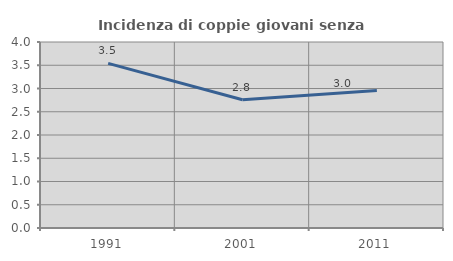
| Category | Incidenza di coppie giovani senza figli |
|---|---|
| 1991.0 | 3.54 |
| 2001.0 | 2.757 |
| 2011.0 | 2.955 |